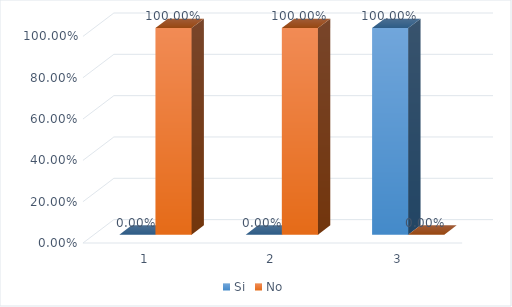
| Category | Si | No |
|---|---|---|
| 0 | 0 | 1 |
| 1 | 0 | 1 |
| 2 | 1 | 0 |